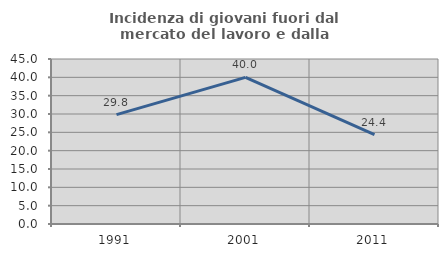
| Category | Incidenza di giovani fuori dal mercato del lavoro e dalla formazione  |
|---|---|
| 1991.0 | 29.822 |
| 2001.0 | 39.975 |
| 2011.0 | 24.405 |